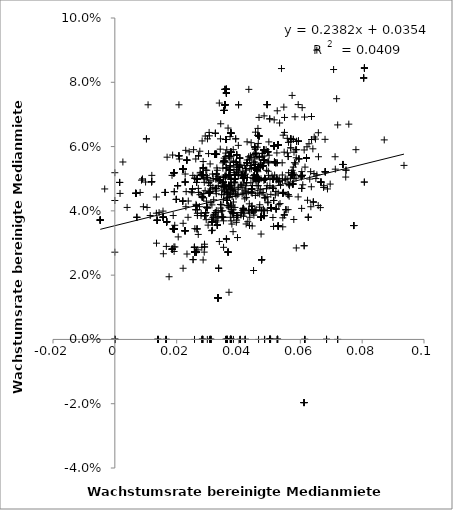
| Category | Series 0 |
|---|---|
| 0.0472984029364403 | 0.033 |
| 0.0584246690257582 | 0.055 |
| 0.0508449237536843 | 0.051 |
| 0.0308237016369515 | 0.055 |
| 0.0258220844768318 | 0.05 |
| 0.0292441796206047 | 0.063 |
| 0.0466201438738298 | 0.063 |
| 0.0594046757396542 | 0.062 |
| 0.0594046757396542 | 0.062 |
| 0.0569020540282394 | 0.062 |
| 0.0466201438738298 | 0.063 |
| 0.0594046757396542 | 0.062 |
| 0.0594046757396542 | 0.062 |
| 0.0594046757396542 | 0.062 |
| 0.0466201438738298 | 0.063 |
| 0.0466201438738298 | 0.063 |
| 0.0305810897801471 | 0.063 |
| 0.0594046757396542 | 0.062 |
| 0.0353198076879537 | 0.055 |
| 0.0594046757396542 | 0.062 |
| 0.0466201438738298 | 0.063 |
| 0.0594046757396542 | 0.062 |
| 0.0495657983080176 | 0.055 |
| 0.0594046757396542 | 0.062 |
| 0.0594046757396542 | 0.062 |
| 0.0594046757396542 | 0.062 |
| 0.0594046757396542 | 0.062 |
| 0.0134735724010606 | 0.03 |
| 0.0191117684152269 | 0.029 |
| 0.0344784002985594 | 0.04 |
| 0.0194391226497097 | 0.029 |
| 0.0418844034228878 | 0.054 |
| 0.0935285444669238 | 0.054 |
| 0.0315879306818856 | 0.034 |
| 0.00862437780222236 | 0.05 |
| 0.0440346832520202 | 0.054 |
| 0.0290255041303815 | 0.029 |
| 0.0440346832520202 | 0.054 |
| 0.0484396235996634 | 0 |
| 0.0290255041303815 | 0.029 |
| 0.0440346832520202 | 0.054 |
| 0.0310253637803168 | 0.047 |
| 0.0299662683665434 | 0.062 |
| 0.0310543992141599 | 0.043 |
| 0.0102231195014653 | 0.062 |
| 0.0102231195014653 | 0.062 |
| 0.0227519969532073 | 0.051 |
| 0.0399107931990526 | 0.051 |
| 0.0275936253738713 | 0.051 |
| 0.0569087104515864 | 0.062 |
| 0.0441367757546314 | 0.057 |
| 0.0569087104515864 | 0.062 |
| 0.032865944644789 | 0.051 |
| 0.0569087104515864 | 0.062 |
| 0.0390930776223894 | 0.062 |
| 0.032865944644789 | 0.051 |
| 0.0399235213975684 | 0.052 |
| 0.032865944644789 | 0.051 |
| 0.0569087104515864 | 0.062 |
| 0.0569087104515864 | 0.062 |
| 0.0390930776223894 | 0.062 |
| 0.0341685858548983 | 0.062 |
| 0.0361094656143461 | 0.047 |
| 0.0520766619585216 | 0.055 |
| 0.0497821215951242 | 0.055 |
| 0.0524157627884947 | 0.058 |
| 0.0525936049077533 | 0.055 |
| 0.0496972744387063 | 0.055 |
| 0.034962676833179 | 0.055 |
| 0.0548895925061723 | 0.069 |
| 0.0543291194043938 | 0.038 |
| 0.0679902764325737 | 0.062 |
| 0.037635381643605 | 0.04 |
| 0.0577273783818577 | 0.062 |
| 0.0448877797362366 | 0.055 |
| 0.0541233372221148 | 0.055 |
| 0.0577273783818577 | 0.062 |
| 0.0520766619585216 | 0.055 |
| 0.0520766619585216 | 0.055 |
| 0.0520766619585216 | 0.055 |
| 0.0374968240368005 | 0.05 |
| 0.0642163880928841 | 0.043 |
| 0.0314682634015913 | 0.037 |
| 0.0314682634015913 | 0.037 |
| 0.0398059265402597 | 0.053 |
| 0.0314682634015913 | 0.037 |
| 0.0416771044579314 | 0.05 |
| 0.0642163880928841 | 0.043 |
| 0.0314682634015913 | 0.037 |
| 0.0504632431386782 | 0.045 |
| 0.0416771044579314 | 0.05 |
| 0.0435568720964394 | 0.035 |
| 0.052220062089732 | 0.05 |
| 0.0314682634015913 | 0.037 |
| 0.0314682634015913 | 0.037 |
| 0.0460748780728162 | 0.06 |
| 0.0501514121459987 | 0.048 |
| 0.0550305197670198 | 0.05 |
| 0.0642163880928841 | 0.043 |
| 0.038374621956627 | 0.043 |
| 0.0295577260319317 | 0.05 |
| 0.0772422752195665 | 0.035 |
| 0.0443065939291676 | 0.04 |
| 0.0658260406202922 | 0.064 |
| 0.0443065939291676 | 0.04 |
| 0.0443065939291676 | 0.04 |
| 0.0443065939291676 | 0.04 |
| 0.0772422752195665 | 0.035 |
| 0.0772422752195665 | 0.035 |
| 0.0586927928464516 | 0.028 |
| 0.0443065939291676 | 0.04 |
| 0.0416142127505978 | 0.038 |
| 0.0443065939291676 | 0.04 |
| 0.0443065939291676 | 0.04 |
| 0.0443065939291676 | 0.04 |
| 0.0443065939291676 | 0.04 |
| 0.0443065939291676 | 0.04 |
| 0.0448694817805331 | 0.021 |
| 0.0443065939291676 | 0.04 |
| 0.0443065939291676 | 0.04 |
| 0.0772422752195665 | 0.035 |
| 0.0772422752195665 | 0.035 |
| 0.0443065939291676 | 0.04 |
| 0.0443065939291676 | 0.04 |
| 0.0772422752195665 | 0.035 |
| 0.0772422752195665 | 0.035 |
| 0.0443065939291676 | 0.04 |
| 0.0772422752195665 | 0.035 |
| 0.0772422752195665 | 0.035 |
| 0.0772422752195665 | 0.035 |
| 0.0443065939291676 | 0.04 |
| 0.0357997942870194 | 0.051 |
| 0.0416771044579314 | 0.05 |
| 0.0416771044579314 | 0.05 |
| 0.053440672431553 | 0.042 |
| 0.0426236892671901 | 0.049 |
| 0.0443801449852812 | 0.042 |
| 0.0464325820333029 | 0.05 |
| 0.0568404868356254 | 0.05 |
| 0.0416771044579314 | 0.05 |
| 0.0452958732018316 | 0.05 |
| 0.0452958732018316 | 0.05 |
| 0.0501905755623937 | 0.05 |
| 0.0452958732018316 | 0.05 |
| 0.0357997942870194 | 0.051 |
| 0.0416771044579314 | 0.05 |
| 0.0484054261651128 | 0.05 |
| 0.0416771044579314 | 0.05 |
| 0.0426236892671901 | 0.049 |
| 0.0416771044579314 | 0.05 |
| 0.0416771044579314 | 0.05 |
| 0.0416771044579314 | 0.05 |
| 0.0452958732018316 | 0.05 |
| 0.0586081034842945 | 0.05 |
| 0.0462905682979529 | 0.05 |
| 0.0603882025434617 | 0.051 |
| 0.0462905682979529 | 0.05 |
| 0.0553515901770947 | 0.04 |
| 0.0452513651188913 | 0.06 |
| 0.0571011818243403 | 0.052 |
| 0.038204094521072 | 0.046 |
| 0.0560424443959484 | 0.045 |
| 0.0397791106799745 | 0.045 |
| 0.0455061313315321 | 0.054 |
| 0.0543660638745334 | 0.045 |
| 0.0452513651188913 | 0.06 |
| 0.047285771294185 | 0.05 |
| 0.0543660638745334 | 0.045 |
| 0.0560424443959484 | 0.045 |
| 0.0560424443959484 | 0.045 |
| 0.0352791091034568 | 0.045 |
| 0.0344964205256921 | 0.045 |
| 0.0275326735456307 | 0.045 |
| 0.0543660638745334 | 0.045 |
| 0.0495354083647999 | 0.043 |
| 0.0444152817091636 | 0.045 |
| 0.0515465456609958 | 0.068 |
| 0.0560424443959484 | 0.04 |
| 0.0543660638745334 | 0.045 |
| 0.0452513651188913 | 0.06 |
| 0.0452513651188913 | 0.06 |
| 0.0528604707316445 | 0.035 |
| 0.0455819761775365 | 0.058 |
| 0.0528604707316445 | 0.035 |
| 0.0455819761775365 | 0.058 |
| 0.0356501917420706 | 0.048 |
| 0.0455819761775365 | 0.058 |
| 0.0496356947694476 | 0.052 |
| 0.0470819553055453 | 0.055 |
| 0.0476981025209366 | 0.058 |
| 0.0441476210562612 | 0.053 |
| 0.0528604707316445 | 0.035 |
| 0.0528604707316445 | 0.035 |
| 0.0476981025209366 | 0.058 |
| 0.0528604707316445 | 0.035 |
| 0.0375722511268068 | 0.057 |
| 0.0528604707316445 | 0.035 |
| 0.0528604707316445 | 0.035 |
| 0.0455819761775365 | 0.058 |
| 0.0528604707316445 | 0.035 |
| 0.0529587247476679 | 0.049 |
| 0.0427824340699137 | 0.061 |
| 0.0476981025209366 | 0.058 |
| 0.0455819761775365 | 0.058 |
| 0.043859609330408 | 0.057 |
| 0.0270578753804043 | 0.057 |
| 0.0207362119368186 | 0.057 |
| 0.0382688452844751 | 0.039 |
| 0.0473446300530473 | 0.04 |
| 0.0295547093287067 | 0.037 |
| 0.0382688452844751 | 0.039 |
| 0.0207362119368186 | 0.057 |
| 0.0420385538553767 | 0.039 |
| 0.0279453529676457 | 0.039 |
| 0.0484715453091311 | 0.05 |
| 0.0134318993965585 | 0.039 |
| 0.0382688452844751 | 0.039 |
| 0.0207362119368186 | 0.057 |
| 0.0369033526360674 | 0.057 |
| 0.0270578753804043 | 0.057 |
| 0.0207362119368186 | 0.057 |
| 0.0369033526360674 | 0.057 |
| 0.0369033526360674 | 0.057 |
| 0.0270578753804043 | 0.057 |
| 0.0382688452844751 | 0.039 |
| 0.0382688452844751 | 0.039 |
| 0.0369450793851307 | 0.051 |
| 0.0387430919919927 | 0.051 |
| 0.0425220778088224 | 0.053 |
| 0.0548300210240191 | 0.039 |
| 0.0387430919919927 | 0.051 |
| 0.0451819702953271 | 0.051 |
| 0.0451819702953271 | 0.051 |
| 0.0387430919919927 | 0.051 |
| 0.0357222627840865 | 0.051 |
| 0.0548300210240191 | 0.039 |
| 0.0409632528508914 | 0.051 |
| 0.0387430919919927 | 0.051 |
| 0.0387430919919927 | 0.051 |
| 0.0541835609492023 | 0.051 |
| 0.0369450793851307 | 0.051 |
| 0.0525707039774213 | 0.05 |
| 0.0387430919919927 | 0.051 |
| 0.0387430919919927 | 0.051 |
| 0.0369450793851307 | 0.051 |
| 0.0387430919919927 | 0.051 |
| 0.0369450793851307 | 0.051 |
| 0.0369450793851307 | 0.051 |
| 0.0387430919919927 | 0.051 |
| 0.0548300210240191 | 0.039 |
| 0.0409632528508914 | 0.051 |
| 0.0409632528508914 | 0.051 |
| 0.0369450793851307 | 0.051 |
| 0.0387430919919927 | 0.051 |
| 0.0516805870386594 | 0.051 |
| 0.0387430919919927 | 0.051 |
| 0.0451819702953271 | 0.051 |
| 0.0653394041351174 | 0.09 |
| 0.0304955450331452 | 0.046 |
| 0.0415252471299639 | 0.046 |
| 0.0288379282387845 | 0.05 |
| 0.0462512829561044 | 0.046 |
| 0.0399553794828043 | 0.051 |
| 0.0304955450331452 | 0.046 |
| 0.0460463643816129 | 0.05 |
| 0.0457102461191368 | 0.04 |
| 0.0528442291706077 | 0.046 |
| 0.0482870864414438 | 0.07 |
| 0.0424314108217294 | 0.046 |
| 0.0579262666283684 | 0.05 |
| 0.0304955450331452 | 0.046 |
| 0.0456737213785305 | 0.05 |
| 0.0304955450331452 | 0.046 |
| 0.0304955450331452 | 0.046 |
| 0.0490973479533403 | 0.053 |
| 0.0383492750697025 | 0 |
| 0.0353198076879537 | 0.055 |
| 0.0353198076879537 | 0.055 |
| 0.0353198076879537 | 0.055 |
| 0.0573003352313326 | 0.051 |
| 0.0573003352313326 | 0.051 |
| 0.0353198076879537 | 0.055 |
| 0.0307082576180826 | 0 |
| 0.0747734431845293 | 0.053 |
| 0.0307082576180826 | 0 |
| 0.0353198076879537 | 0.055 |
| 0.0573003352313326 | 0.051 |
| 0.0353198076879537 | 0.055 |
| 0.0498999003991762 | 0.057 |
| 0.0353198076879537 | 0.055 |
| 0.0353198076879537 | 0.055 |
| 0.0353198076879537 | 0.055 |
| 0.0353198076879537 | 0.055 |
| 0.0353198076879537 | 0.055 |
| 0.0353198076879537 | 0.055 |
| 0.0353198076879537 | 0.055 |
| 0.0353198076879537 | 0.055 |
| 0.0573003352313326 | 0.051 |
| 0.0747734431845293 | 0.053 |
| 0.0353198076879537 | 0.055 |
| 0.0353198076879537 | 0.055 |
| 0.0307082576180826 | 0 |
| 0.0573003352313326 | 0.051 |
| 0.0455066909183917 | 0.058 |
| 0.0353198076879537 | 0.055 |
| 0.0564592785420854 | 0.048 |
| 0.0202972748596211 | 0.048 |
| 0.0377354071730436 | 0.048 |
| 0.037417035385632 | 0.042 |
| 0.0573777183329627 | 0.053 |
| 0.0155837171684363 | 0.04 |
| 0.044542376353341503 | 0.048 |
| 0.0493183635168868 | 0.04 |
| 0.0592885117630979 | 0.044 |
| 0.0362012318330105 | 0.045 |
| 0.0202972748596211 | 0.048 |
| 0.0498159370916695 | 0.061 |
| 0.0525300743515269 | 0.071 |
| 0.0490600486085766 | 0.047 |
| 0.0436129926880189 | 0.039 |
| 0.056160020828097 | 0.061 |
| 0.0413800505373541 | 0.052 |
| 0.0423422971844358 | 0.048 |
| 0.0393006852970745 | 0.036 |
| 0.0314029209496547 | 0.042 |
| 0.0334560689335137 | 0.048 |
| 0.0392030665735692 | 0.045 |
| 0.0372202644659614 | 0.045 |
| 0.0202972748596211 | 0.048 |
| 0.0464507500169884 | 0.048 |
| 0.0459998736737812 | 0.048 |
| 0.0676134078580226 | 0.048 |
| 0.0482817091107526 | 0.057 |
| 0.0440893045428497 | 0.061 |
| 0.080702520468481 | 0.049 |
| 0.0666612613517283 | 0.049 |
| 0.0737381102675203 | 0.054 |
| 0.0666612613517283 | 0.049 |
| 0.0737381102675203 | 0.054 |
| 0.0737381102675203 | 0.054 |
| 0.0666612613517283 | 0.049 |
| 0.0737381102675203 | 0.054 |
| 0.0443065939291676 | 0.04 |
| 0.0666612613517283 | 0.049 |
| 0.0623321375022665 | 0.043 |
| 0.0737381102675203 | 0.054 |
| 0.0737381102675203 | 0.054 |
| 0.0737381102675203 | 0.054 |
| 0.0640520166158893 | 0.059 |
| 0.0737381102675203 | 0.054 |
| 0.0666612613517283 | 0.049 |
| 0.0737381102675203 | 0.054 |
| 0.0443065939291676 | 0.04 |
| 0.0443065939291676 | 0.04 |
| 0.0584707768649135 | 0.059 |
| 0.0575869908044555 | 0.048 |
| 0.0575869908044555 | 0.048 |
| 0.080702520468481 | 0.049 |
| 0.0575869908044555 | 0.048 |
| 0.0575869908044555 | 0.048 |
| 0.0520919358211276 | 0.046 |
| 0.0443065939291676 | 0.04 |
| 0.0607951337190284 | 0.048 |
| 0.0612369984701053 | 0.029 |
| 0.0575869908044555 | 0.048 |
| 0.0612369984701053 | 0.029 |
| 0.0562545404592139 | 0.048 |
| 0.0575869908044555 | 0.048 |
| 0.0696539827434155 | 0.048 |
| 0.0420646894564927 | 0.046 |
| 0.0456666701600073 | 0.049 |
| 0.0573003352313326 | 0.051 |
| 0.0480665104200839 | 0.041 |
| 0.0573003352313326 | 0.051 |
| 0.0579511497886538 | 0.058 |
| 0.0513064625401964 | 0.05 |
| 0.0531576924896258 | 0.05 |
| 0.0454287598336365 | 0.059 |
| 0.057801944742685 | 0.052 |
| 0.0340972681136567 | 0.059 |
| 0.0573003352313326 | 0.051 |
| 0.0454287598336365 | 0.05 |
| 0.0561921375354835 | 0.052 |
| 0.0333993027119903 | 0.04 |
| 0.0436405939084159 | 0.053 |
| 0.0505791370910895 | 0.041 |
| 0.0454287598336365 | 0.05 |
| 0.0454287598336365 | 0.05 |
| 0.0454287598336365 | 0.05 |
| 0.0387342173266769 | 0.05 |
| 0.0454287598336365 | 0.059 |
| 0.0454287598336365 | 0.05 |
| 0.0454287598336365 | 0.05 |
| 0.0454287598336365 | 0.05 |
| 0.031833657879903 | 0.05 |
| 0.0435643011968943 | 0.056 |
| 0.0454287598336365 | 0.05 |
| 0.0454287598336365 | 0.05 |
| 0.0530299029175476 | 0.042 |
| 0.0573003352313326 | 0.051 |
| 0.0375835638952138 | 0.037 |
| 0.0454287598336365 | 0.05 |
| 0.0448929203208228 | 0.05 |
| 0.0390297180227828 | 0.05 |
| 0.0650315600592728 | 0.05 |
| 0.0327328984404125 | 0.05 |
| 0.0258574501630766 | 0.05 |
| 0.0448929203208228 | 0.05 |
| 0.0332436054100091 | 0.05 |
| 0.0454287598336365 | 0.05 |
| 0.0454287598336365 | 0.05 |
| 0.0573003352313326 | 0.051 |
| 0.0386392371587356 | 0.049 |
| 0.0604209926113932 | 0.041 |
| 0.0454287598336365 | 0.05 |
| 0.0653459294060108 | 0.051 |
| 0.0573003352313326 | 0.051 |
| 0.0273840940065768 | 0.041 |
| 0.063408107969688 | 0.041 |
| 0.00923716981220779 | 0.041 |
| 0.0542197524269332 | 0.05 |
| 0.0431397189497869 | 0.046 |
| 0.0543171442004196 | 0.035 |
| 0.0377315301323664 | 0.041 |
| 0.0492714487924277 | 0.048 |
| 0.0342247414461392 | 0.041 |
| 0.0229867575478426 | 0.041 |
| 0.0519171445929087 | 0.045 |
| 0.0369211953342259 | 0.015 |
| 0.0202972748596211 | 0.048 |
| 0.0374598755301823 | 0.048 |
| 0.0403869043116603 | 0.056 |
| 0.0361992282423145 | 0.047 |
| -0.0032744868645358 | 0.047 |
| 0.0403869043116603 | 0.056 |
| 0.0484396235996634 | 0 |
| 0.0687806297301181 | 0.047 |
| 0.037983776117561 | 0.047 |
| 0.0423662073004567 | 0.047 |
| 0.0595390688335009 | 0.056 |
| 0.0484396235996634 | 0 |
| 0.0442661235245647 | 0.047 |
| 0.0442661235245647 | 0.047 |
| 0.0595390688335009 | 0.056 |
| 0.0403869043116603 | 0.056 |
| 0.0442661235245647 | 0.047 |
| 0.0595390688335009 | 0.056 |
| 0.0442661235245647 | 0.047 |
| 0.0324242879414642 | 0.047 |
| 0.0442661235245647 | 0.047 |
| 0.0403869043116603 | 0.056 |
| 0.0353769518680289 | 0.056 |
| 0.0399446551708096 | 0.06 |
| 0.0442661235245647 | 0.047 |
| 0.0442661235245647 | 0.047 |
| 0.0403869043116603 | 0.056 |
| 0.0251166730902559 | 0.047 |
| 0.0466201438738298 | 0.063 |
| 0.0544561943355606 | 0.064 |
| 0.0464963532244236 | 0.049 |
| 0.0327186093081506 | 0.037 |
| 0.0442661235245647 | 0.047 |
| 0.0470452222375763 | 0.047 |
| 0.0361992282423145 | 0.047 |
| 0.0251166730902559 | 0.047 |
| 0.0251166730902559 | 0.047 |
| 0.04714834857383 | 0.054 |
| 0.0371028203594996 | 0.057 |
| 0.04714834857383 | 0.054 |
| 0.0358626176106958 | 0.057 |
| 0.04714834857383 | 0.054 |
| 0.04714834857383 | 0.054 |
| 0.0392702480261697 | 0.055 |
| 0.0392702480261697 | 0.055 |
| 0.0371028203594996 | 0.057 |
| 0.04714834857383 | 0.054 |
| 0.0383917669002296 | 0.055 |
| 0.0392702480261697 | 0.055 |
| 0.0560666493982671 | 0.057 |
| 0.04714834857383 | 0.054 |
| 0.0392702480261697 | 0.055 |
| 0.0371028203594996 | 0.057 |
| 0.0383917669002296 | 0.055 |
| 0.0359276336798957 | 0.055 |
| 0.0407315220090843 | 0.054 |
| 0.0315786513380802 | 0.051 |
| 0.0383917669002296 | 0.055 |
| 0.04714834857383 | 0.054 |
| 0.0383917669002296 | 0.055 |
| 0.04714834857383 | 0.054 |
| 0.038868415865438 | 0.049 |
| 0.04714834857383 | 0.054 |
| 0.04714834857383 | 0.054 |
| 0.0560666493982671 | 0.057 |
| 0.0371028203594996 | 0.057 |
| 0.04714834857383 | 0.054 |
| 0.0434980385302159 | 0.042 |
| 0.0383917669002296 | 0.055 |
| 0.0383917669002296 | 0.055 |
| 0.04714834857383 | 0.054 |
| 0.0482094424528854 | 0.049 |
| 0.0492673607964367 | 0.044 |
| 0.0468493753295023 | 0.045 |
| 0.0459486665399436 | 0.053 |
| 0.0459486665399436 | 0.053 |
| 0.0459486665399436 | 0.053 |
| 0.0459486665399436 | 0.053 |
| 0.0459486665399436 | 0.053 |
| 0.031280470537121 | 0.034 |
| 0.0459486665399436 | 0.053 |
| 0.0459486665399436 | 0.053 |
| 0.0297437940407836 | 0.053 |
| 0.0459486665399436 | 0.053 |
| 0.0459486665399436 | 0.053 |
| 0.0459486665399436 | 0.053 |
| 0.0459486665399436 | 0.053 |
| 0.0331530225401599 | 0.053 |
| 0.0459486665399436 | 0.053 |
| 0.0459486665399436 | 0.053 |
| 0.0459486665399436 | 0.053 |
| 0.0459486665399436 | 0.053 |
| 0.0459486665399436 | 0.053 |
| 0.0459486665399436 | 0.053 |
| 0.0454647681330216 | 0.045 |
| 0.0459486665399436 | 0.053 |
| 0.0459486665399436 | 0.053 |
| 0.0459486665399436 | 0.053 |
| 0.0459486665399436 | 0.053 |
| 0.0459486665399436 | 0.053 |
| 0.034002110361077 | 0.05 |
| 0.0190941686628812 | 0.052 |
| 0.0 | 0.052 |
| 0.034002110361077 | 0.05 |
| 0.0190941686628812 | 0.052 |
| 0.0190941686628812 | 0.052 |
| 0.0190941686628812 | 0.052 |
| 0.0190941686628812 | 0.052 |
| 0.034002110361077 | 0.05 |
| 0.0190941686628812 | 0.052 |
| 0.0190941686628812 | 0.052 |
| 0.0190941686628812 | 0.052 |
| 0.0190941686628812 | 0.052 |
| 0.0190941686628812 | 0.052 |
| 0.0190941686628812 | 0.052 |
| 0.0190941686628812 | 0.052 |
| 0.034002110361077 | 0.05 |
| 0.034002110361077 | 0.05 |
| 0.034002110361077 | 0.05 |
| 0.034002110361077 | 0.05 |
| 0.034002110361077 | 0.05 |
| 0.034002110361077 | 0.05 |
| 0.034002110361077 | 0.05 |
| 0.0563518647260612 | 0.048 |
| 0.034002110361077 | 0.05 |
| 0.0485284336987426 | 0.044 |
| 0.0807393708570812 | 0.084 |
| 0.0807393708570812 | 0.084 |
| 0.0468756318206065 | 0.042 |
| 0.0684694710224032 | 0 |
| 0.0422799218333159 | 0.053 |
| 0.0473029427790062 | 0.038 |
| 0.0473029427790062 | 0.038 |
| 0.0422799218333159 | 0.053 |
| 0.0604646852805368 | 0.052 |
| 0.0684694710224032 | 0 |
| 0.0473029427790062 | 0.038 |
| 0.0613585742024887 | 0.069 |
| 0.0871391679211371 | 0.062 |
| 0.0422799218333159 | 0.053 |
| 0.0807393708570812 | 0.084 |
| 0.0422799218333159 | 0.053 |
| 0.0684694710224032 | 0 |
| 0.0422799218333159 | 0.053 |
| 0.0684694710224032 | 0 |
| 0.0422799218333159 | 0.053 |
| 0.0684694710224032 | 0 |
| 0.0807393708570812 | 0.084 |
| 0.0684694710224032 | 0 |
| 0.0587736260717879 | 0.059 |
| 0.0614265599663222 | 0 |
| 0.0648959489652792 | 0.062 |
| 0.0481240648168171 | 0.059 |
| 0.0481240648168171 | 0.059 |
| 0.0501003796388515 | 0.069 |
| 0.0614265599663222 | 0 |
| 0.0481240648168171 | 0.059 |
| 0.0481240648168171 | 0.059 |
| 0.0756779988902363 | 0.067 |
| 0.0501003796388515 | 0.069 |
| 0.0489430261531465 | 0.059 |
| 0.0481240648168171 | 0.059 |
| 0.0779850369702089 | 0.059 |
| 0.0614265599663222 | 0 |
| 0.0481240648168171 | 0.059 |
| 0.0614265599663222 | 0 |
| 0.0382976740098093 | 0.059 |
| 0.0481240648168171 | 0.059 |
| 0.0720867159661667 | 0 |
| 0.0481240648168171 | 0.059 |
| 0.0481240648168171 | 0.059 |
| 0.0807393708570812 | 0.084 |
| 0.0481240648168171 | 0.059 |
| 0.062164494041584 | 0.06 |
| 0.0614265599663222 | 0 |
| 0.0481240648168171 | 0.059 |
| 0.0720867159661667 | 0.067 |
| 0.0511375232612856 | 0.038 |
| 0.0481240648168171 | 0.059 |
| 0.0481240648168171 | 0.059 |
| 0.0481240648168171 | 0.059 |
| 0.0481240648168171 | 0.059 |
| 0.0720867159661667 | 0 |
| 0.0481240648168171 | 0.059 |
| 0.0397058847292195 | 0.054 |
| 0.0397058847292195 | 0.054 |
| 0.0397058847292195 | 0.054 |
| 0.0378607087616749 | 0.036 |
| 0.0397058847292195 | 0.054 |
| 0.03937679817604 | 0.057 |
| 0.03937679817604 | 0.057 |
| 0.0397058847292195 | 0.054 |
| 0.0397058847292195 | 0.054 |
| 0.03937679817604 | 0.057 |
| 0.0299644818216773 | 0.05 |
| 0.0186927173821407 | 0.057 |
| 0.03937679817604 | 0.057 |
| 0.0397058847292195 | 0.054 |
| 0.03937679817604 | 0.057 |
| 0.0459310553739898 | 0.05 |
| 0.0459310553739898 | 0.05 |
| 0.0459310553739898 | 0.05 |
| 0.03937679817604 | 0.057 |
| 0.03937679817604 | 0.057 |
| 0.03937679817604 | 0.057 |
| 0.03937679817604 | 0.057 |
| 0.0397058847292195 | 0.054 |
| 0.0327125357914222 | 0.046 |
| 0.0459310553739898 | 0.05 |
| 0.03937679817604 | 0.057 |
| 0.0428986596094694 | 0.05 |
| 0.0630379927520792 | 0.05 |
| 0.03937679817604 | 0.057 |
| 0.0459310553739898 | 0.05 |
| 0.03937679817604 | 0.057 |
| 0.03937679817604 | 0.057 |
| 0.03937679817604 | 0.057 |
| 0.03937679817604 | 0.057 |
| 0.0580852999342927 | 0.051 |
| 0.03937679817604 | 0.057 |
| 0.0397058847292195 | 0.054 |
| 0.03937679817604 | 0.057 |
| 0.037244769948374 | 0.053 |
| 0.0353661302898753 | 0.071 |
| 0.0353661302898753 | 0.071 |
| 0.0353661302898753 | 0.071 |
| 0.0353661302898753 | 0.071 |
| 0.037244769948374 | 0.053 |
| 0.0353661302898753 | 0.071 |
| 0.0353661302898753 | 0.071 |
| 0.037244769948374 | 0.053 |
| 0.037244769948374 | 0.053 |
| 0.0353661302898753 | 0.071 |
| 0.0353661302898753 | 0.071 |
| 0.037244769948374 | 0.053 |
| 0.0353661302898753 | 0.071 |
| 0.0353661302898753 | 0.071 |
| 0.037244769948374 | 0.053 |
| 0.037244769948374 | 0.053 |
| 0.0337913286458593 | 0.074 |
| 0.0353661302898753 | 0.071 |
| 0.037244769948374 | 0.053 |
| 0.037244769948374 | 0.053 |
| 0.0304996811132454 | 0.064 |
| 0.037244769948374 | 0.053 |
| 0.0362089545506648 | 0.059 |
| 0.0516392926688234 | 0.055 |
| 0.0192271966381887 | 0.046 |
| 0.0192271966381887 | 0.046 |
| 0.0308310182374945 | 0.046 |
| 0.0383604912639859 | 0.056 |
| 0.0308310182374945 | 0.046 |
| 0.0359462082734463 | 0 |
| 0.0516392926688234 | 0.055 |
| 0.0516392926688234 | 0.055 |
| 0.0516392926688234 | 0.055 |
| 0.0516392926688234 | 0.055 |
| 0.0308310182374945 | 0.046 |
| 0.0359462082734463 | 0 |
| 0.0359462082734463 | 0 |
| 0.0516392926688234 | 0.055 |
| 0.0516392926688234 | 0.055 |
| 0.0516392926688234 | 0.055 |
| 0.0335956325926388 | 0.05 |
| 0.0308310182374945 | 0.046 |
| 0.0308310182374945 | 0.046 |
| 0.0516392926688234 | 0.055 |
| 0.0516392926688234 | 0.055 |
| 0.0516392926688234 | 0.055 |
| 0.037933557384751 | 0.044 |
| 0.0359462082734463 | 0 |
| 0.0308310182374945 | 0.046 |
| 0.0383648733455848 | 0.046 |
| 0.0516392926688234 | 0.055 |
| 0.0359462082734463 | 0 |
| 0.0516392926688234 | 0.055 |
| 0.0308310182374945 | 0.046 |
| 0.0375328844429066 | 0.058 |
| 0.0375328844429066 | 0.058 |
| 0.0375328844429066 | 0.058 |
| 0.0375328844429066 | 0.058 |
| 0.036096478169356 | 0.077 |
| 0.0375328844429066 | 0.058 |
| 0.0375328844429066 | 0.058 |
| 0.0375328844429066 | 0.058 |
| 0.0375328844429066 | 0.058 |
| 0.0375328844429066 | 0.058 |
| 0.036096478169356 | 0.077 |
| 0.0375328844429066 | 0.058 |
| 0.0375328844429066 | 0.058 |
| 0.0375328844429066 | 0.058 |
| 0.0375328844429066 | 0.058 |
| 0.0375328844429066 | 0.058 |
| 0.0 | 0 |
| 0.0375328844429066 | 0.058 |
| 0.036096478169356 | 0.077 |
| 0.0375328844429066 | 0.058 |
| 0.036096478169356 | 0.077 |
| 0.036096478169356 | 0.077 |
| 0.0375328844429066 | 0.058 |
| 0.0375328844429066 | 0.058 |
| 0.036096478169356 | 0.077 |
| 0.0375328844429066 | 0.058 |
| 0.0375328844429066 | 0.058 |
| 0.0375328844429066 | 0.058 |
| 0.0375328844429066 | 0.058 |
| 0.0375328844429066 | 0.058 |
| 0.036096478169356 | 0.077 |
| 0.036096478169356 | 0.077 |
| 0.0375328844429066 | 0.058 |
| 0.0375328844429066 | 0.058 |
| 0.0375328844429066 | 0.058 |
| 0.0375328844429066 | 0.058 |
| 0.036096478169356 | 0.077 |
| 0.0657760275816002 | 0.042 |
| 0.080478184324642 | 0.081 |
| 0.0415757568477044 | 0.041 |
| 0.0415757568477044 | 0.041 |
| 0.0547659410388084 | 0.058 |
| 0.0415757568477044 | 0.041 |
| 0.0415757568477044 | 0.041 |
| 0.0415757568477044 | 0.041 |
| 0.0415757568477044 | 0.041 |
| 0.0415757568477044 | 0.041 |
| 0.0415757568477044 | 0.041 |
| 0.080478184324642 | 0.081 |
| 0.0415757568477044 | 0.041 |
| 0.080478184324642 | 0.081 |
| 0.080478184324642 | 0.081 |
| 0.0347121079334913 | 0.046 |
| 0.0346087158621209 | 0.042 |
| 0.0299335709016959 | 0.041 |
| 0.00676191218384359 | 0.045 |
| 0.0521678647761601 | 0.041 |
| 0.0139565429647734 | 0 |
| 0.00676191218384359 | 0.045 |
| 0.0139565429647734 | 0 |
| 0.00676191218384359 | 0.045 |
| 0.00676191218384359 | 0.045 |
| 0.00676191218384359 | 0.045 |
| 0.00676191218384359 | 0.045 |
| 0.00676191218384359 | 0.045 |
| 0.00168518958981911 | 0.045 |
| 0.0139565429647734 | 0 |
| 0.00676191218384359 | 0.045 |
| 0.0139565429647734 | 0 |
| 0.00676191218384359 | 0.045 |
| 0.0139565429647734 | 0 |
| 0.0287734147258654 | 0.045 |
| 0.0139565429647734 | 0 |
| 0.0139565429647734 | 0 |
| 0.00676191218384359 | 0.045 |
| 0.00676191218384359 | 0.045 |
| 0.00676191218384359 | 0.045 |
| 0.00676191218384359 | 0.045 |
| 0.0266978812976 | 0.039 |
| 0.00676191218384359 | 0.045 |
| 0.00676191218384359 | 0.045 |
| 0.0139565429647734 | 0 |
| 0.0422041087768772 | 0 |
| 0.0137395292338038 | 0.037 |
| 0.0137395292338038 | 0.037 |
| 0.0337996704267369 | 0.03 |
| 0.028165520873485 | 0.051 |
| 0.0422041087768772 | 0 |
| 0.028165520873485 | 0.051 |
| 0.0422041087768772 | 0 |
| 0.0422041087768772 | 0 |
| 0.0137395292338038 | 0.037 |
| 0.0137395292338038 | 0.037 |
| 0.0137395292338038 | 0.037 |
| 0.0137395292338038 | 0.037 |
| 0.028165520873485 | 0.051 |
| 0.0137395292338038 | 0.037 |
| 0.0422041087768772 | 0 |
| 0.028165520873485 | 0.051 |
| 0.028165520873485 | 0 |
| 0.028165520873485 | 0.051 |
| 0.028165520873485 | 0.051 |
| 0.0137395292338038 | 0.037 |
| 0.041736209817625 | 0.049 |
| 0.028165520873485 | 0.051 |
| 0.028165520873485 | 0.051 |
| 0.028165520873485 | 0.051 |
| 0.028165520873485 | 0.051 |
| 0.028165520873485 | 0.051 |
| 0.028165520873485 | 0.051 |
| 0.028165520873485 | 0.051 |
| 0.028165520873485 | 0.051 |
| 0.028165520873485 | 0.051 |
| 0.028165520873485 | 0.051 |
| 0.028165520873485 | 0.051 |
| 0.028165520873485 | 0.051 |
| 0.028165520873485 | 0.051 |
| 0.0422041087768772 | 0 |
| 0.028165520873485 | 0.051 |
| 0.0137395292338038 | 0.037 |
| 0.0137395292338038 | 0.037 |
| 0.042795014427609 | 0.055 |
| 0.042795014427609 | 0.055 |
| 0.042795014427609 | 0.055 |
| 0.0492689382578564 | 0.073 |
| 0.042795014427609 | 0.055 |
| 0.0492689382578564 | 0.073 |
| 0.042795014427609 | 0.055 |
| 0.0492689382578564 | 0.073 |
| 0.042795014427609 | 0.055 |
| 0.0492689382578564 | 0.073 |
| 0.042795014427609 | 0.055 |
| 0.044870672749459 | 0.04 |
| 0.0593142183447044 | 0.073 |
| 0.042795014427609 | 0.055 |
| 0.0580920689402302 | 0.055 |
| 0.042795014427609 | 0.055 |
| 0.042795014427609 | 0.055 |
| 0.0492689382578564 | 0.073 |
| 0.0492689382578564 | 0.073 |
| 0.019231333383761 | 0.034 |
| 0.019231333383761 | 0.034 |
| 0.019231333383761 | 0.034 |
| 0.026606906533813 | 0.034 |
| 0.019231333383761 | 0.034 |
| 0.019231333383761 | 0.034 |
| 0.019231333383761 | 0.034 |
| 0.019231333383761 | 0.034 |
| 0.019231333383761 | 0.034 |
| 0.019231333383761 | 0.034 |
| 0.019231333383761 | 0.034 |
| 0.026606906533813 | 0.034 |
| 0.019231333383761 | 0.034 |
| 0.019231333383761 | 0.034 |
| 0.019231333383761 | 0.034 |
| 0.019231333383761 | 0.034 |
| 0.019231333383761 | 0.034 |
| 0.019231333383761 | 0.034 |
| 0.019231333383761 | 0.034 |
| 0.019231333383761 | 0.034 |
| 0.019231333383761 | 0.034 |
| 0.019231333383761 | 0.034 |
| 0.019231333383761 | 0.034 |
| 0.019231333383761 | 0.034 |
| 0.019231333383761 | 0.034 |
| 0.019231333383761 | 0.034 |
| 0.019231333383761 | 0.034 |
| 0.019231333383761 | 0.034 |
| 0.019231333383761 | 0.034 |
| 0.019231333383761 | 0.034 |
| 0.019231333383761 | 0.034 |
| 0.0186447319381229 | 0.034 |
| 0.019231333383761 | 0.034 |
| 0.019231333383761 | 0.034 |
| 0.019231333383761 | 0.034 |
| 0.026606906533813 | 0.034 |
| 0.019231333383761 | 0.034 |
| 0.019231333383761 | 0.034 |
| 0.0473029427790062 | 0.038 |
| 0.06259009583922 | 0.038 |
| 0.0185586229297294 | 0.028 |
| 0.06259009583922 | 0.038 |
| 0.0185586229297294 | 0.028 |
| 0.0473029427790062 | 0.038 |
| 0.0473029427790062 | 0.038 |
| 0.0473029427790062 | 0.038 |
| 0.0473029427790062 | 0.038 |
| 0.0473029427790062 | 0.038 |
| 0.06259009583922 | 0.038 |
| 0.0473029427790062 | 0.038 |
| 0.0473029427790062 | 0.038 |
| 0.0473029427790062 | 0.038 |
| 0.0473029427790062 | 0.038 |
| 0.0473029427790062 | 0.038 |
| 0.0473029427790062 | 0.038 |
| 0.0473029427790062 | 0.038 |
| 0.0424693664966929 | 0.036 |
| 0.0185586229297294 | 0.028 |
| 0.0185586229297294 | 0.028 |
| 0.0361367131724135 | 0.031 |
| 0.0191771799526681 | 0.027 |
| 0.0635580231123405 | 0.047 |
| 0.0675219813791221 | 0.047 |
| 0.0473029427790062 | 0.038 |
| 0.0473029427790062 | 0.038 |
| 0.0473029427790062 | 0.038 |
| 0.0473029427790062 | 0.038 |
| 0.0444256543658648 | 0.035 |
| 0.0185586229297294 | 0.028 |
| 0.0644215315326591 | 0.052 |
| 0.0436464591342745 | 0.038 |
| 0.0185586229297294 | 0.028 |
| 0.0373573127051652 | 0.038 |
| 0.0473029427790062 | 0.038 |
| 0.0345711931408541 | 0.038 |
| 0.0473029427790062 | 0.038 |
| 0.0473029427790062 | 0.038 |
| 0.0473029427790062 | 0.038 |
| 0.0384881407289448 | 0.038 |
| 0.0227292140169599 | 0.034 |
| 0.0227292140169599 | 0.034 |
| 0.0227292140169599 | 0.034 |
| 0.0557856203372633 | 0.063 |
| 0.0227292140169599 | 0.034 |
| 0.0227292140169599 | 0.034 |
| 0.0227292140169599 | 0.034 |
| 0.0227292140169599 | 0.034 |
| 0.034887172734023 | 0.038 |
| 0.0227292140169599 | 0.034 |
| 0.0227292140169599 | 0.034 |
| 0.0227292140169599 | 0.034 |
| 0.0227292140169599 | 0.034 |
| 0.0227292140169599 | 0.034 |
| 0.019231333383761 | 0.034 |
| 0.0227292140169599 | 0.034 |
| 0.0227292140169599 | 0.034 |
| 0.0227292140169599 | 0.034 |
| 0.0227292140169599 | 0.034 |
| 0.0531608548004783 | 0.049 |
| 0.0227292140169599 | 0.034 |
| 0.0227292140169599 | 0.034 |
| 0.0227292140169599 | 0.034 |
| 0.0227292140169599 | 0.034 |
| 0.0227292140169599 | 0.034 |
| 0.0227292140169599 | 0.034 |
| 0.034887172734023 | 0.038 |
| 0.0227292140169599 | 0.034 |
| 0.0227292140169599 | 0.034 |
| 0.0227292140169599 | 0.034 |
| 0.0227292140169599 | 0.034 |
| 0.0 | 0 |
| 0.0227292140169599 | 0.034 |
| 0.0263208806605477 | 0.027 |
| 0.0402801772222552 | 0.054 |
| 0.0402801772222552 | 0.054 |
| 0.019231333383761 | 0.034 |
| 0.0263208806605477 | 0.027 |
| 0.0263208806605477 | 0.027 |
| 0.0263208806605477 | 0.027 |
| 0.019231333383761 | 0.034 |
| 0.019231333383761 | 0.034 |
| 0.019231333383761 | 0.034 |
| 0.0284507333033146 | 0 |
| 0.019231333383761 | 0.034 |
| 0.019231333383761 | 0.034 |
| 0.0 | 0.027 |
| 0.0263208806605477 | 0.027 |
| 0.0263208806605477 | 0.027 |
| 0.0284507333033146 | 0 |
| 0.0402801772222552 | 0.054 |
| 0.0263208806605477 | 0.027 |
| 0.0263208806605477 | 0.027 |
| 0.0402801772222552 | 0.054 |
| 0.019231333383761 | 0.034 |
| 0.0263208806605477 | 0.027 |
| 0.0402801772222552 | 0.054 |
| 0.0284507333033146 | 0 |
| 0.0263208806605477 | 0.027 |
| 0.0237585508070162 | 0.043 |
| 0.0375882167583117 | 0.04 |
| 0.0269822239632185 | 0.033 |
| 0.0262536489255225 | 0.042 |
| 0.0290327921550277 | 0.039 |
| 0.0290327921550277 | 0.039 |
| 0.0114448481225327 | 0.039 |
| 0.0290327921550277 | 0.039 |
| 0.0290327921550277 | 0.039 |
| 0.0290327921550277 | 0.039 |
| 0.0290327921550277 | 0.039 |
| 0.0290327921550277 | 0.039 |
| 0.0290327921550277 | 0.039 |
| 0.0290327921550277 | 0.039 |
| 0.0290327921550277 | 0.039 |
| 0.0327038435368847 | 0.05 |
| 0.0290327921550277 | 0.039 |
| 0.0333913734169862 | 0.051 |
| 0.0290327921550277 | 0.039 |
| 0.0290327921550277 | 0.039 |
| 0.0290327921550277 | 0.039 |
| 0.0290327921550277 | 0.039 |
| 0.0290327921550277 | 0.039 |
| 0.0267068399051826 | 0.039 |
| 0.0290327921550277 | 0.039 |
| 0.0290327921550277 | 0.039 |
| 0.0290327921550277 | 0.039 |
| 0.0290327921550277 | 0.039 |
| 0.0278730461053067 | 0.039 |
| 0.0290327921550277 | 0.039 |
| 0.0290327921550277 | 0.039 |
| 0.0290327921550277 | 0.039 |
| 0.0290327921550277 | 0.039 |
| 0.0389037695814412 | 0.05 |
| 0.0188808704789776 | 0.039 |
| 0.0290327921550277 | 0.039 |
| 0.0290327921550277 | 0.039 |
| 0.0290327921550277 | 0.039 |
| 0.0484053551320782 | 0.039 |
| 0.0290327921550277 | 0.039 |
| 0.0349554889589172 | 0.049 |
| 0.0349554889589172 | 0.049 |
| 0.0349554889589172 | 0.049 |
| 0.0521678647761601 | 0.041 |
| 0.0304491245573411 | 0.049 |
| 0.0349554889589172 | 0.049 |
| 0.0264403603912229 | 0.049 |
| 0.0349554889589172 | 0.049 |
| 0.00154870753711611 | 0.049 |
| 0.0349554889589172 | 0.049 |
| -0.00471215320339369 | 0.037 |
| 0.0205049137274089 | 0.032 |
| 0.0349554889589172 | 0.049 |
| 0.0349554889589172 | 0.049 |
| 0.0264403603912229 | 0.049 |
| 0.031974211877444 | 0.043 |
| 0.0349554889589172 | 0.049 |
| 0.0349554889589172 | 0.049 |
| 0.00154870753711611 | 0.049 |
| 0.0349554889589172 | 0.049 |
| 0.0349554889589172 | 0.049 |
| 0.0349554889589172 | 0.049 |
| 0.0390203686337263 | 0.045 |
| 0.0349554889589172 | 0.049 |
| 0.0521678647761601 | 0.041 |
| 0.0521678647761601 | 0.041 |
| 0.0264403603912229 | 0.049 |
| 0.0264403603912229 | 0.049 |
| 0.00154870753711611 | 0.049 |
| 0.0349554889589172 | 0.049 |
| 0.0349554889589172 | 0.049 |
| 0.0349554889589172 | 0.049 |
| 0.00154870753711611 | 0.049 |
| 0.0331923163567496 | 0.036 |
| 0.0331923163567496 | 0.036 |
| 0.0331923163567496 | 0.036 |
| 0.0331923163567496 | 0.036 |
| 0.0331923163567496 | 0.036 |
| 0.0331923163567496 | 0.036 |
| 0.0331923163567496 | 0.036 |
| 0.0331923163567496 | 0.036 |
| 0.0320714095437991 | 0.039 |
| 0.0331923163567496 | 0.036 |
| 0.0193712884379029 | 0.036 |
| 0.0268714881367866 | 0.028 |
| 0.0331923163567496 | 0.036 |
| 0.0331923163567496 | 0.036 |
| 0.0331923163567496 | 0.036 |
| 0.0331923163567496 | 0.036 |
| 0.0331923163567496 | 0.036 |
| 0.0408772075892272 | 0.039 |
| 0.0400175479344282 | 0.073 |
| 0.0293530248543579 | 0.039 |
| 0.0207327320421329 | 0.073 |
| 0.0606466199910898 | 0.051 |
| 0.0406043645340342 | 0.048 |
| 0.0606466199910898 | 0.051 |
| 0.0285826759603505 | 0.051 |
| 0.0356200685764121 | 0.073 |
| 0.0356200685764121 | 0.073 |
| 0.0107480138380207 | 0.073 |
| 0.0408772075892272 | 0.039 |
| 0.0285826759603505 | 0.051 |
| 0.0606466199910898 | 0.051 |
| 0.0356200685764121 | 0.073 |
| 0.0408772075892272 | 0.039 |
| 0.0356200685764121 | 0.073 |
| 0.0293530248543579 | 0.039 |
| 0.0356200685764121 | 0.073 |
| 0.0143092908595095 | 0.039 |
| 0.0606466199910898 | 0.051 |
| 0.0356200685764121 | 0.073 |
| 0.0293530248543579 | 0.039 |
| 0.0356200685764121 | 0.073 |
| 0.0400175479344282 | 0.073 |
| 0.0356200685764121 | 0.073 |
| 0.0285826759603505 | 0.051 |
| 0.0356200685764121 | 0.073 |
| 0.0356200685764121 | 0.073 |
| 0.0395177008248273 | 0.039 |
| 0.0297082316020467 | 0.041 |
| 0.0297082316020467 | 0.041 |
| 0.0297082316020467 | 0.041 |
| 0.0297082316020467 | 0.041 |
| 0.0395177008248273 | 0.039 |
| 0.0394007461301535 | 0.037 |
| 0.0297082316020467 | 0.041 |
| 0.0297082316020467 | 0.041 |
| 0.0104259633014376 | 0.041 |
| -0.00471215320339369 | 0.037 |
| 0.0297082316020467 | 0.041 |
| 0.00260225047959151 | 0.055 |
| 0.0290141695948987 | 0.03 |
| 0.0297082316020467 | 0.041 |
| 0.0297082316020467 | 0.041 |
| 0.0388533869318826 | 0.041 |
| -0.00471215320339369 | 0.037 |
| 0.00398023013067483 | 0.041 |
| 0.0395177008248273 | 0.039 |
| 0.0395177008248273 | 0.039 |
| -0.00471215320339369 | 0.037 |
| -0.00471215320339369 | 0.037 |
| 0.0297082316020467 | 0.041 |
| 0.0297082316020467 | 0.041 |
| -0.00471215320339369 | 0.037 |
| -0.00471215320339369 | 0.037 |
| 0.0175474287715991 | 0.02 |
| 0.0333676030779309 | 0.013 |
| 0.0333676030779309 | 0.013 |
| 0.0333676030779309 | 0.013 |
| 0.0333676030779309 | 0.013 |
| 0.0333676030779309 | 0.013 |
| 0.0333676030779309 | 0.013 |
| 0.0333676030779309 | 0.013 |
| 0.0333676030779309 | 0.013 |
| 0.0333676030779309 | 0.013 |
| 0.0333676030779309 | 0.013 |
| 0.0333676030779309 | 0.013 |
| 0.0333676030779309 | 0.013 |
| 0.0 | 0 |
| 0.0333676030779309 | 0.013 |
| 0.0333676030779309 | 0.013 |
| 0.0333676030779309 | 0.013 |
| 0.0333676030779309 | 0.013 |
| 0.022071045541783 | 0.053 |
| 0.022071045541783 | 0.053 |
| 0.022071045541783 | 0.053 |
| 0.022071045541783 | 0.053 |
| 0.022071045541783 | 0.053 |
| 0.022071045541783 | 0.053 |
| 0.0327265186425745 | 0.037 |
| 0.022071045541783 | 0.053 |
| 0.022071045541783 | 0.053 |
| 0.022071045541783 | 0.053 |
| 0.022071045541783 | 0.053 |
| 0.022071045541783 | 0.053 |
| 0.022071045541783 | 0.053 |
| 0.0713089567075167 | 0.053 |
| 0.022071045541783 | 0.053 |
| 0.022071045541783 | 0.053 |
| 0.022071045541783 | 0.053 |
| 0.022071045541783 | 0.053 |
| 0.022071045541783 | 0.053 |
| 0.022071045541783 | 0.053 |
| 0.022071045541783 | 0.053 |
| 0.022071045541783 | 0.053 |
| 0.0199174943550671 | 0.044 |
| 0.0199174943550671 | 0.044 |
| 0.0199174943550671 | 0.044 |
| 0.0199174943550671 | 0.044 |
| 0.0342496945279092 | 0.067 |
| 0.0199174943550671 | 0.044 |
| 0.0199174943550671 | 0.044 |
| 0.0199174943550671 | 0.044 |
| 0.0199174943550671 | 0.044 |
| 0.0289293564705404 | 0.049 |
| 0.0199174943550671 | 0.044 |
| 0.0402801772222552 | 0.054 |
| 0.0402801772222552 | 0.054 |
| 0.0165828516718596 | 0 |
| 0.0402801772222552 | 0.054 |
| 0.0402801772222552 | 0.054 |
| 0.0165828516718596 | 0 |
| 0.0344049986950588 | 0.048 |
| 0.0402801772222552 | 0.054 |
| 0.0402801772222552 | 0.054 |
| 0.0402801772222552 | 0.054 |
| 0.0165828516718596 | 0 |
| 0.0156956718498167 | 0.027 |
| 0.0165828516718596 | 0 |
| 0.0165828516718596 | 0 |
| 0.0402801772222552 | 0.054 |
| 0.0402801772222552 | 0.054 |
| 0.023065841596537 | 0.046 |
| 0.0341731705675907 | 0.042 |
| 0.0301672509971744 | 0.036 |
| 0.0411734888969673 | 0.045 |
| 0.0425573035465743 | 0.044 |
| 0.0313411276238154 | 0.037 |
| 0.0363027894750492 | 0 |
| 0.0267027751293041 | 0.05 |
| 0.050587004071222 | 0.041 |
| 0.0267027751293041 | 0.05 |
| 0.0267027751293041 | 0.05 |
| 0.0363027894750492 | 0 |
| 0.0267027751293041 | 0.05 |
| 0.050587004071222 | 0.041 |
| 0.0267027751293041 | 0.05 |
| 0.050587004071222 | 0.041 |
| 0.0363027894750492 | 0 |
| 0.0267027751293041 | 0.05 |
| 0.0317079137922756 | 0.047 |
| 0.0363027894750492 | 0 |
| 0.050587004071222 | 0.041 |
| 0.050587004071222 | 0.041 |
| 0.0360706654689562 | 0.031 |
| 0.0267027751293041 | 0.05 |
| 0.0363027894750492 | 0 |
| 0.050587004071222 | 0.041 |
| 0.0363027894750492 | 0 |
| 0.0374775790655306 | 0.047 |
| 0.0552618354817467 | 0.05 |
| 0.0 | 0 |
| 0.050587004071222 | 0.041 |
| 0.0267027751293041 | 0.05 |
| 0.0267027751293041 | 0.05 |
| 0.0267027751293041 | 0.05 |
| 0.0360872881069307 | 0.078 |
| 0.0360872881069307 | 0.078 |
| 0.050587004071222 | 0.041 |
| 0.0351360100015583 | 0.037 |
| 0.0363027894750492 | 0 |
| 0.0267027751293041 | 0.05 |
| 0.0363027894750492 | 0 |
| 0.0267027751293041 | 0.05 |
| 0.00894316481325075 | 0.05 |
| 0.050587004071222 | 0.041 |
| 0.0557416740993846 | 0.05 |
| 0.0267027751293041 | 0.05 |
| 0.0267027751293041 | 0.05 |
| 0.0363027894750492 | 0 |
| 0.0664801229914267 | 0.041 |
| 0.050587004071222 | 0.041 |
| 0.0363027894750492 | 0 |
| 0.050587004071222 | 0.041 |
| 0.0433406041488205 | 0.078 |
| 0.0267027751293041 | 0.05 |
| 0.0267027751293041 | 0.05 |
| 0.050587004071222 | 0.041 |
| 0.0 | 0 |
| 0.050587004071222 | 0.041 |
| 0.050587004071222 | 0.041 |
| 0.0363027894750492 | 0 |
| 0.0267027751293041 | 0.05 |
| 0.050587004071222 | 0.041 |
| 0.0363027894750492 | 0 |
| 0.0360872881069307 | 0.078 |
| 0.0287373782174287 | 0.044 |
| 0.0604598189422885 | 0.047 |
| 0.038246329921783 | 0.034 |
| 0.0220881712202619 | 0.036 |
| 0.0325137230974133 | 0.039 |
| 0.039808605512597 | 0.047 |
| 0.0293530248543579 | 0.039 |
| 0.0366618079424572 | 0.042 |
| 0.0250237010196868 | 0.046 |
| 0.0394057274512918 | 0.053 |
| 0.0389223122336881 | 0.046 |
| 0.0366618079424572 | 0.042 |
| 0.0355805332783126 | 0.051 |
| 0.056377130197234 | 0.045 |
| 0.0293530248543579 | 0.039 |
| 0.0325137230974133 | 0.039 |
| 0.0292089162038425 | 0.046 |
| 0.0293530248543579 | 0.039 |
| 0.0604598189422885 | 0.047 |
| 0.0379308440486565 | 0.039 |
| 0.0325137230974133 | 0.039 |
| 0.0233350322441317 | 0.027 |
| 0.0293530248543579 | 0.039 |
| 0.0293530248543579 | 0.039 |
| 0.0270063798212141 | 0.047 |
| 0.0261775087924736 | 0.04 |
| 0.0448148891720666 | 0.051 |
| 0.0266992466074814 | 0.04 |
| 0.0310713982088573 | 0.049 |
| 0.0349558789537794 | 0.053 |
| 0.0553236888426181 | 0.04 |
| 0.0261775087924736 | 0.04 |
| 0.0185056164434814 | 0.051 |
| 0.0261775087924736 | 0.056 |
| 0.0440089024275372 | 0.049 |
| 0.0553236888426181 | 0.04 |
| 0.0208681049798904 | 0.056 |
| 0.0382726931556796 | 0.04 |
| 0.0387405666439551 | 0.049 |
| 0.011884776785519 | 0.049 |
| 0.0351357854391363 | 0.043 |
| 0.0373914918649865 | 0.045 |
| 0.011884776785519 | 0.049 |
| 0.0417728855190249 | 0.04 |
| 0.011884776785519 | 0.049 |
| 0.011884776785519 | 0.049 |
| 0.011884776785519 | 0.049 |
| 0.0328270100303036 | 0.04 |
| 0.011884776785519 | 0.049 |
| 0.0328183281912677 | 0.045 |
| 0.0252385898569765 | 0.051 |
| 0.011884776785519 | 0.049 |
| 0.0219625371506122 | 0.043 |
| 0.011884776785519 | 0.049 |
| 0.0219625371506122 | 0.043 |
| 0.0351700216593009 | 0.049 |
| 0.0219625371506122 | 0.043 |
| 0.0357326501063535 | 0.048 |
| 0.0419479306239683 | 0.051 |
| 0.0296431216068376 | 0.043 |
| 0.0330027199837772 | 0.053 |
| 0.0496982045103935 | 0.051 |
| 0.0219625371506122 | 0.043 |
| 0.011884776785519 | 0.049 |
| 0.011884776785519 | 0.049 |
| 0.0119615125132859 | 0.051 |
| 0.0285697782779493 | 0.055 |
| 0.0324563048191371 | 0.058 |
| 0.0232752539298127 | 0.056 |
| 0.0324563048191371 | 0.058 |
| 0.0324563048191371 | 0.058 |
| 0.0324563048191371 | 0.058 |
| 0.0324563048191371 | 0.058 |
| 0.0324563048191371 | 0.058 |
| 0.048216879670598 | 0.056 |
| 0.0232752539298127 | 0.056 |
| 0.0324563048191371 | 0.058 |
| 0.048216879670598 | 0.056 |
| 0.0324563048191371 | 0.058 |
| 0.0324563048191371 | 0.058 |
| 0.048216879670598 | 0.056 |
| 0.0232752539298127 | 0.056 |
| 0.048216879670598 | 0.056 |
| 0.0232752539298127 | 0.056 |
| 0.0328949159729799 | 0.058 |
| 0.0232752539298127 | 0.056 |
| 0.0328949159729799 | 0.058 |
| 0.0324563048191371 | 0.058 |
| 0.048216879670598 | 0.056 |
| 0.0328949159729799 | 0.058 |
| 0.0324563048191371 | 0.058 |
| 0.0324563048191371 | 0.058 |
| 0.0306842568484431 | 0.046 |
| 0.048216879670598 | 0.056 |
| 0.0232752539298127 | 0.056 |
| 0.0328949159729799 | 0.058 |
| 0.0328949159729799 | 0.058 |
| 0.048216879670598 | 0.056 |
| 0.0328949159729799 | 0.058 |
| 0.0324563048191371 | 0.058 |
| 0.0324563048191371 | 0.058 |
| 0.048216879670598 | 0.056 |
| 0.048216879670598 | 0.056 |
| 0.0324563048191371 | 0.058 |
| 0.0485521529032888 | 0.044 |
| 0.038515875814146 | 0.052 |
| 0.0353313959914254 | 0.048 |
| 0.0353313959914254 | 0.048 |
| 0.0353313959914254 | 0.048 |
| 0.0353313959914254 | 0.048 |
| 0.0420280295428677 | 0.044 |
| 0.035178537130671 | 0.05 |
| 0.049490001424773 | 0.043 |
| 0.0364165735555795 | 0.044 |
| 0.0353313959914254 | 0.048 |
| 0.0485521529032888 | 0.044 |
| 0.0294200035648966 | 0.053 |
| 0.0353313959914254 | 0.048 |
| 0.0353313959914254 | 0.048 |
| 0.0407928793411745 | 0.039 |
| 0.0356423183310162 | 0.078 |
| 0.0360872881069307 | 0.078 |
| 0.0360872881069307 | 0.078 |
| 0.0680914819416409 | 0.052 |
| 0.0680914819416409 | 0.052 |
| 0.0360872881069307 | 0.078 |
| 0.0746863015227368 | 0.051 |
| 0.0680914819416409 | 0.052 |
| 0.0360872881069307 | 0.078 |
| 0.0573449129200165 | 0.076 |
| 0.0356423183310162 | 0.078 |
| 0.0360872881069307 | 0.078 |
| 0.0680914819416409 | 0.052 |
| 0.0680914819416409 | 0.052 |
| 0.0360872881069307 | 0.078 |
| 0.0360872881069307 | 0.078 |
| 0.0680914819416409 | 0.052 |
| 0.0680914819416409 | 0.052 |
| 0.0356423183310162 | 0.078 |
| 0.0462281871278476 | 0.052 |
| 0.0360872881069307 | 0.078 |
| 0.0680914819416409 | 0.052 |
| 0.0680914819416409 | 0.052 |
| 0.0356423183310162 | 0.078 |
| 0.0466407741705523 | 0.069 |
| 0.0633308124770309 | 0.052 |
| 0.0360872881069307 | 0.078 |
| 0.0355583068367029 | 0.046 |
| 0.0276208573134864 | 0.052 |
| 0.0467882135091884 | 0.041 |
| 0.0354881931334163 | 0.046 |
| 0.0156694052668136 | 0.038 |
| 0.0264086418635601 | 0.042 |
| 0.0299708311058215 | 0.041 |
| 0.0156694052668136 | 0.038 |
| 0.0398325336821721 | 0.038 |
| 0.0236764078577296 | 0.038 |
| 0.0247458659036623 | 0.046 |
| 0.0303159469266898 | 0.058 |
| 0.0156694052668136 | 0.038 |
| 0.00712005585042319 | 0.038 |
| 0.0156694052668136 | 0.038 |
| 0.0285604482258028 | 0.025 |
| 0.0156694052668136 | 0.038 |
| 0.03087945694521 | 0.048 |
| 0.0264086418635601 | 0.042 |
| 0.042271020535305 | 0.051 |
| 0.0264086418635601 | 0.042 |
| 0.0156694052668136 | 0.038 |
| 0.0326042804990814 | 0.047 |
| 0.00712005585042319 | 0.038 |
| 0.0299207996870134 | 0 |
| 0.0156694052668136 | 0.038 |
| 0.0156694052668136 | 0.038 |
| 0.0264086418635601 | 0.042 |
| 0.0264086418635601 | 0.042 |
| 0.0351894250682054 | 0.038 |
| 0.0156694052668136 | 0.038 |
| 0.0156694052668136 | 0.038 |
| 0.0264086418635601 | 0.042 |
| 0.00712005585042319 | 0.038 |
| 0.0264086418635601 | 0.042 |
| 0.0376268883439876 | 0 |
| 0.0281419018859286 | 0.029 |
| 0.0229343085314462 | 0.059 |
| 0.0258801077718054 | 0.034 |
| 0.0282986283124811 | 0 |
| 0.0376268883439876 | 0 |
| 0.0376268883439876 | 0 |
| 0.0376268883439876 | 0 |
| 0.0282986283124811 | 0 |
| 0.0707591433775714 | 0.084 |
| 0.0257529239415402 | 0.029 |
| 0.0282986283124811 | 0 |
| 0.035167246804064 | 0.029 |
| 0.0257529239415402 | 0.029 |
| 0.0282986283124811 | 0 |
| 0.0376268883439876 | 0 |
| 0.0257529239415402 | 0.029 |
| 0.0376268883439876 | 0 |
| 0.0257529239415402 | 0.029 |
| 0.0282986283124811 | 0 |
| 0.0282986283124811 | 0 |
| 0.0376268883439876 | 0 |
| 0.0257529239415402 | 0.029 |
| 0.0376268883439876 | 0 |
| 0.0282986283124811 | 0 |
| 0.0282986283124811 | 0 |
| 0.0257733142511336 | 0.027 |
| 0.0400615787046805 | 0.047 |
| 0.0257733142511336 | 0.027 |
| 0.0257733142511336 | 0.027 |
| 0.0257733142511336 | 0.027 |
| 0.0257733142511336 | 0.027 |
| 0.0257733142511336 | 0.027 |
| 0.0257733142511336 | 0.027 |
| 0.0 | 0 |
| 0.0257733142511336 | 0.027 |
| 0.0257733142511336 | 0.027 |
| 0.0257733142511336 | 0 |
| 0.0366270764258889 | 0.027 |
| 0.0257733142511336 | 0.027 |
| 0.028908974868985 | 0.027 |
| 0.0257733142511336 | 0.027 |
| 0.0366270764258889 | 0.027 |
| 0.0257733142511336 | 0.027 |
| 0.0257733142511336 | 0.027 |
| 0.0257733142511336 | 0.027 |
| 0.0257733142511336 | 0.027 |
| 0.0366270764258889 | 0.027 |
| 0.0257733142511336 | 0.027 |
| 0.0366270764258889 | 0.066 |
| 0.0257733142511336 | 0.027 |
| 0.0366270764258889 | 0.027 |
| 0.0257733142511336 | 0.027 |
| 0.0257733142511336 | 0.027 |
| 0.0366270764258889 | 0.027 |
| 0.0257733142511336 | 0.027 |
| 0.0257733142511336 | 0.027 |
| 0.0257733142511336 | 0.027 |
| 0.0257733142511336 | 0.027 |
| 0.0257733142511336 | 0.027 |
| 0.0257733142511336 | 0.027 |
| 0.0 | 0 |
| 0.0366270764258889 | 0.027 |
| 0.0167336789618642 | 0.037 |
| 0.0167336789618642 | 0.037 |
| 0.0 | 0 |
| 0.0167336789618642 | 0.037 |
| 0.0167336789618642 | 0.037 |
| 0.0167336789618642 | 0.037 |
| 0.0167336789618642 | 0.037 |
| 0.0167336789618642 | 0.037 |
| 0.0282356581083527 | 0.062 |
| 0.0167336789618642 | 0.037 |
| 0.0167336789618642 | 0.037 |
| 0.0167336789618642 | 0.037 |
| 0.0 | 0 |
| 0.0167336789618642 | 0.037 |
| 0.0167336789618642 | 0.037 |
| 0.0167336789618642 | 0.037 |
| 0.0167336789618642 | 0.037 |
| 0.0167336789618642 | 0.037 |
| 0.0167336789618642 | 0.037 |
| 0.0167336789618642 | 0.037 |
| 0.0167336789618642 | 0.037 |
| 0.0167336789618642 | 0.037 |
| 0.0167336789618642 | 0.037 |
| 0.0167336789618642 | 0.037 |
| 0.0167336789618642 | 0.037 |
| 0.0167336789618642 | 0.037 |
| 0.0374963347692556 | 0.064 |
| 0.0374963347692556 | 0.064 |
| 0.0374963347692556 | 0.064 |
| 0.0374963347692556 | 0.064 |
| 0.0374963347692556 | 0.064 |
| 0.0374963347692556 | 0.064 |
| 0.0374963347692556 | 0.064 |
| 0.0374963347692556 | 0.064 |
| 0.0374963347692556 | 0.064 |
| 0.0463939478466711 | 0.061 |
| 0.0374963347692556 | 0.064 |
| 0.0374963347692556 | 0.064 |
| 0.0374963347692556 | 0.064 |
| 0.0374963347692556 | 0.064 |
| 0.0374963347692556 | 0.064 |
| 0.0374963347692556 | 0.064 |
| 0.0374963347692556 | 0.064 |
| 0.0325276273025237 | 0.064 |
| 0.0374963347692556 | 0.064 |
| 0.0374963347692556 | 0.064 |
| 0.0374963347692556 | 0.064 |
| 0.0374963347692556 | 0.064 |
| 0.0374963347692556 | 0.064 |
| 0.0374963347692556 | 0.064 |
| 0.0374963347692556 | 0 |
| 0.0325276273025237 | 0.064 |
| 0.0374963347692556 | 0.064 |
| 0.0325276273025237 | 0.064 |
| 0.0374963347692556 | 0.064 |
| 0.0374963347692556 | 0.064 |
| 0.0374963347692556 | 0.064 |
| 0.0474553902704891 | 0.025 |
| 0.0474553902704891 | 0.025 |
| 0.0253114749463157 | 0.025 |
| 0.0474553902704891 | 0.025 |
| 0.0474553902704891 | 0.025 |
| 0.0474553902704891 | 0.025 |
| 0.0449738381740097 | 0.039 |
| 0.0430149189436875 | 0.037 |
| 0.0282999024881287 | 0.044 |
| 0.0474553902704891 | 0.025 |
| 0.0474553902704891 | 0.025 |
| 0.0282999024881287 | 0.044 |
| 0.0369736039577022 | 0.044 |
| 0.0474553902704891 | 0.025 |
| 0.0474553902704891 | 0.025 |
| 0.0369736039577022 | 0.044 |
| 0.013439726902617 | 0.044 |
| 0.0474553902704891 | 0.025 |
| 0.0282999024881287 | 0.044 |
| 0.0333950670464165 | 0.038 |
| 0.0282999024881287 | 0.044 |
| 0.0282999024881287 | 0.044 |
| 0.0253114749463157 | 0.025 |
| 0.0317501276602645 | 0.038 |
| 0.0413228606470979 | 0.04 |
| 0.0282999024881287 | 0.044 |
| 0.0474553902704891 | 0.025 |
| 0.0474553902704891 | 0.025 |
| 0.0474553902704891 | 0.025 |
| 0.0318931417793289 | 0.038 |
| 0.0474553902704891 | 0.025 |
| 0.0282999024881287 | 0.044 |
| 0.049476539204983 | 0.058 |
| 0.0368799505256687 | 0.048 |
| 0.0373985267470651 | 0 |
| 0.0373985267470651 | 0 |
| 0.0368799505256687 | 0.048 |
| 0.0373985267470651 | 0 |
| 0.0373985267470651 | 0 |
| 0.049476539204983 | 0.058 |
| 0.0368799505256687 | 0.048 |
| 0.0368799505256687 | 0.048 |
| 0.0166574240924628 | 0.029 |
| 0.0368799505256687 | 0.048 |
| 0.0368799505256687 | 0.048 |
| 0.0373985267470651 | 0 |
| 0.0373985267470651 | 0 |
| 0.049476539204983 | 0.058 |
| 0.0373985267470651 | 0 |
| 0.0240595997573487 | 0.058 |
| 0.0368799505256687 | 0.048 |
| 0.0373985267470651 | 0 |
| 0.0373985267470651 | 0 |
| 0.0411693000640769 | 0.047 |
| 0.0303535287472358 | 0.049 |
| 0.0 | 0 |
| 0.0368799505256687 | 0.048 |
| 0.0368799505256687 | 0.048 |
| 0.0368799505256687 | 0.048 |
| 0.0368799505256687 | 0.048 |
| 0.0368799505256687 | 0.048 |
| 0.0368799505256687 | 0.048 |
| 0.049476539204983 | 0.058 |
| 0.0368799505256687 | 0.048 |
| 0.0373985267470651 | 0 |
| 0.0373985267470651 | 0 |
| 0.0373985267470651 | 0 |
| 0.0368799505256687 | 0.048 |
| 0.049476539204983 | 0.058 |
| 0.0373985267470651 | 0 |
| 0.0368799505256687 | 0.048 |
| 0.049476539204983 | 0.058 |
| 0.0364807735356798 | 0.046 |
| 0.0310264396643156 | 0 |
| 0.0169058947337168 | 0.057 |
| 0.0310264396643156 | 0 |
| 0.0364807735356798 | 0.046 |
| 0.0310264396643156 | 0 |
| 0.0364807735356798 | 0.046 |
| 0.0310264396643156 | 0 |
| 0.0364807735356798 | 0.046 |
| 0.0364807735356798 | 0.046 |
| 0.0364807735356798 | 0.046 |
| 0.0364807735356798 | 0.046 |
| 0.0310264396643156 | 0 |
| 0.0310264396643156 | 0 |
| 0.00818646292529723 | 0.046 |
| 0.0310264396643156 | 0 |
| 0.0441185340322969 | 0.046 |
| 0.0364807735356798 | 0.046 |
| 0.0270947669753454 | 0.046 |
| 0.0364807735356798 | 0.046 |
| 0.0364807735356798 | 0.046 |
| 0.0274876556866164 | 0.059 |
| 0.0364807735356798 | 0.046 |
| 0.0310264396643156 | 0 |
| 0.0364807735356798 | 0.046 |
| 0.0364807735356798 | 0.046 |
| 0.0364807735356798 | 0.046 |
| 0.0364807735356798 | 0.046 |
| 0.0364807735356798 | 0.046 |
| 0.0503586714959736 | 0 |
| 0.0603613899044559 | 0.051 |
| 0.0503586714959736 | 0 |
| 0.050343394317113 | 0 |
| 0.0482356166269358 | 0.038 |
| 0.0603613899044559 | 0.051 |
| 0.0603613899044559 | 0.051 |
| 0.041260834650791 | 0.051 |
| 0.0482356166269358 | 0.038 |
| 0.0503586714959736 | 0 |
| 0.0503586714959736 | 0 |
| 0.0442502097583384 | 0.041 |
| 0.0603613899044559 | 0.051 |
| 0.050343394317113 | 0 |
| 0.0603613899044559 | 0.051 |
| 0.0603613899044559 | 0.051 |
| 0.0603613899044559 | 0.051 |
| 0.0603613899044559 | 0.051 |
| 0.0603613899044559 | 0.051 |
| 0.0396747326020481 | 0.032 |
| 0.0603613899044559 | 0.051 |
| 0.0603613899044559 | 0.051 |
| 0.0603613899044559 | 0.051 |
| 0.0603613899044559 | 0.051 |
| 0.0603613899044559 | 0.051 |
| 0.0603613899044559 | 0.051 |
| 0.0603613899044559 | 0.051 |
| 0.0603613899044559 | 0.051 |
| 0.041260834650791 | 0.051 |
| 0.0603613899044559 | 0.051 |
| 0.0385211087673583 | 0.049 |
| 0.041260834650791 | 0.051 |
| 0.0603613899044559 | 0.051 |
| 0.0603613899044559 | 0.051 |
| 0.0603613899044559 | 0.051 |
| 0.0503586714959736 | 0 |
| 0.0454878557360863 | 0.064 |
| 0.0503586714959736 | 0 |
| 0.0603613899044559 | 0.051 |
| 0.0482356166269358 | 0.038 |
| 0.0503586714959736 | 0 |
| 0.0503586714959736 | 0 |
| 0.0603613899044559 | 0.051 |
| 0.0603613899044559 | 0.051 |
| 0.0603613899044559 | 0.051 |
| 0.0603613899044559 | 0.051 |
| 0.0603613899044559 | 0.051 |
| 0.0578874727392222 | 0.037 |
| 0.0603613899044559 | 0.051 |
| 0.0295987791109 | 0.051 |
| 0.0482356166269358 | 0.038 |
| 0.0575623212859415 | 0.051 |
| 0.062802977051551 | 0.061 |
| 0.0461494954903943 | 0.064 |
| 0.0462911288640591 | 0.066 |
| 0.0375454693675201 | 0.048 |
| 0.040540503649944 | 0 |
| 0.046489533312539 | 0.054 |
| 0.0612409485583592 | 0.059 |
| 0.046489533312539 | 0.054 |
| 0.040540503649944 | 0 |
| 0.040540503649944 | 0 |
| 0.0532949252081527 | 0.067 |
| 0.0526426285670691 | 0 |
| 0.0526426285670691 | 0 |
| 0.0615134104665263 | 0.054 |
| 0.0526426285670691 | 0 |
| 0.046489533312539 | 0.054 |
| 0.0717390745932474 | 0.075 |
| 0.040540503649944 | 0 |
| 0.046489533312539 | 0.054 |
| 0.0526426285670691 | 0 |
| 0.046489533312539 | 0.054 |
| 0.046489533312539 | 0.054 |
| 0.0526426285670691 | 0 |
| 0.046489533312539 | 0.054 |
| 0.040540503649944 | 0 |
| 0.046489533312539 | 0.054 |
| 0.046489533312539 | 0.054 |
| 0.0526426285670691 | 0 |
| 0.046489533312539 | 0.054 |
| 0.046489533312539 | 0.054 |
| 0.046489533312539 | 0.054 |
| 0.046489533312539 | 0.054 |
| 0.046489533312539 | 0.054 |
| 0.0548703716926517 | 0.064 |
| 0.046489533312539 | 0.054 |
| 0.0450215231861821 | 0.058 |
| 0.046489533312539 | 0.054 |
| 0.046489533312539 | 0.054 |
| 0.046489533312539 | 0.054 |
| 0.046489533312539 | 0.054 |
| 0.0515138684318981 | 0.06 |
| 0.046489533312539 | 0.054 |
| 0.0586752425886481 | 0.057 |
| 0.046489533312539 | 0.054 |
| 0.0515138684318981 | 0.06 |
| 0.0515138684318981 | 0.06 |
| 0.046489533312539 | 0.054 |
| 0.0515138684318981 | 0.06 |
| 0.046489533312539 | 0.054 |
| 0.0515138684318981 | 0.06 |
| 0.0568931905164984 | 0.06 |
| 0.045111758848116 | 0.055 |
| 0.046489533312539 | 0 |
| 0.046489533312539 | 0.054 |
| 0.0515138684318981 | 0.06 |
| 0.0515138684318981 | 0.06 |
| 0.0577450297524971 | 0.054 |
| 0.0385253450599359 | 0.054 |
| 0.0515138684318981 | 0.06 |
| 0.0515138684318981 | 0.06 |
| 0.0582734086491483 | 0.069 |
| 0.046489533312539 | 0.054 |
| 0.0515138684318981 | 0.06 |
| 0.0515138684318981 | 0.06 |
| 0.0538993331927013 | 0.084 |
| 0.0476695877131008 | 0.057 |
| 0.046489533312539 | 0.054 |
| 0.0568931905164984 | 0.06 |
| 0.046489533312539 | 0.054 |
| 0.0515138684318981 | 0.06 |
| 0.0515138684318981 | 0.06 |
| 0.046489533312539 | 0.054 |
| 0.046489533312539 | 0.054 |
| 0.046489533312539 | 0.054 |
| 0.0 | 0 |
| 0.028645523293783 | 0.053 |
| 0.036047551605709 | 0.053 |
| 0.045309110402044 | 0.053 |
| 0.0363951034562904 | 0.043 |
| 0.028645523293783 | 0.053 |
| 0.028645523293783 | 0.053 |
| 0.0605913119203279 | 0.072 |
| 0.028645523293783 | 0.053 |
| 0.036047551605709 | 0.053 |
| 0.036047551605709 | 0.053 |
| 0.028645523293783 | 0.053 |
| 0.028645523293783 | 0.053 |
| 0.045309110402044 | 0.053 |
| 0.0636032560182729 | 0.069 |
| 0.028645523293783 | 0.053 |
| 0.028645523293783 | 0.053 |
| 0.028645523293783 | 0.053 |
| 0.036047551605709 | 0.053 |
| 0.028645523293783 | 0.053 |
| 0.028645523293783 | 0.053 |
| 0.045309110402044 | 0.053 |
| 0.045309110402044 | 0.053 |
| 0.028645523293783 | 0.053 |
| 0.028645523293783 | 0.053 |
| 0.028645523293783 | 0.053 |
| 0.045309110402044 | 0.053 |
| 0.0511314037604855 | 0.047 |
| 0.0328069963523778 | 0.047 |
| 0.0511314037604855 | 0.047 |
| 0.0511314037604855 | 0.047 |
| 0.0463008970836156 | 0.05 |
| 0.0463008970836156 | 0.05 |
| 0.0446233460795762 | 0.05 |
| 0.0463008970836156 | 0.05 |
| 0.0511314037604855 | 0.047 |
| 0.0463008970836156 | 0.05 |
| 0.0511314037604855 | 0.047 |
| 0.0523290320604748 | 0.05 |
| 0.0453532229200802 | 0.056 |
| 0.0463008970836156 | 0.05 |
| 0.0463008970836156 | 0.05 |
| 0.0523290320604748 | 0.05 |
| 0.0413384843291142 | 0.05 |
| 0.0463008970836156 | 0.05 |
| 0.0463008970836156 | 0.05 |
| 0.0393515389439438 | 0.052 |
| 0.0463008970836156 | 0.05 |
| 0.0454551462358084 | 0.05 |
| 0.0328069963523778 | 0.047 |
| 0.0511314037604855 | 0.047 |
| 0.0511314037604855 | 0.047 |
| 0.0463008970836156 | 0.05 |
| 0.0463008970836156 | 0.05 |
| 0.0463008970836156 | 0.05 |
| 0.0328069963523778 | 0.047 |
| 0.0511314037604855 | 0.047 |
| 0.0523290320604748 | 0.05 |
| 0.0511314037604855 | 0.047 |
| 0.0463008970836156 | 0.05 |
| 0.0511314037604855 | 0.047 |
| 0.0525741799514987 | 0 |
| 0.0453298267708468 | 0.04 |
| 0.0525741799514987 | 0 |
| 0.0474894350253401 | 0.04 |
| 0.0372775019223854 | 0.063 |
| 0.0525741799514987 | 0 |
| 0.0434497955929289 | 0.04 |
| 0.037760917531301 | 0.042 |
| 0.0348759397294112 | 0.04 |
| 0.0525741799514987 | 0 |
| 0.0525741799514987 | 0 |
| 0.0474894350253401 | 0.04 |
| 0.0453298267708468 | 0.04 |
| 0.048005638198297 | 0.046 |
| 0.0525741799514987 | 0 |
| 0.0432203149470984 | 0.04 |
| 0.0484401226805842 | 0.04 |
| 0.0319079453458719 | 0.038 |
| 0.0162793105182988 | 0.046 |
| 0.0162793105182988 | 0.046 |
| 0.0545267924140078 | 0.046 |
| 0.0335624596221278 | 0.022 |
| 0.0331235514416144 | 0.038 |
| 0.0476031467643385 | 0.046 |
| 0.0162793105182988 | 0.046 |
| 0.0220787834843674 | 0.022 |
| 0.0545267924140078 | 0.046 |
| 0.0545267924140078 | 0.046 |
| 0.0162793105182988 | 0.046 |
| 0.0545267924140078 | 0.046 |
| 0.0335624596221278 | 0.022 |
| 0.0545267924140078 | 0.046 |
| 0.0369335515015119 | 0.041 |
| 0.0545267924140078 | 0.046 |
| 0.0335624596221278 | 0.022 |
| 0.0545267924140078 | 0.046 |
| 0.036040373417191 | 0.062 |
| 0.036040373417191 | 0.062 |
| 0.0527881949236597 | 0.061 |
| 0.036040373417191 | 0.062 |
| 0.0558191770581442 | 0.058 |
| 0.0527881949236597 | 0.061 |
| 0.0619946337470418 | 0.056 |
| 0.0527881949236597 | 0.061 |
| 0.0254738437385889 | 0.059 |
| 0.0527881949236597 | 0.061 |
| 0.036040373417191 | 0.062 |
| 0.0619946337470418 | 0.056 |
| 0.036040373417191 | 0.062 |
| 0.0527881949236597 | 0.061 |
| 0.0527881949236597 | 0.061 |
| 0.0527881949236597 | 0.061 |
| 0.036040373417191 | 0.062 |
| 0.0527881949236597 | 0.061 |
| 0.0619946337470418 | 0.056 |
| 0.0619946337470418 | 0.056 |
| 0.0636224698371977 | 0.062 |
| 0.0527881949236597 | 0.061 |
| 0.0619946337470418 | 0.056 |
| 0.036040373417191 | 0.062 |
| 0.0527881949236597 | 0.061 |
| 0.0527881949236597 | 0.061 |
| 0.0527881949236597 | 0.061 |
| 0.0369690682837727 | 0.056 |
| 0.0619946337470418 | 0.056 |
| 0.0527881949236597 | 0.061 |
| 0.036040373417191 | 0.062 |
| 0.0619946337470418 | 0.056 |
| 0.036040373417191 | 0.062 |
| 0.0619946337470418 | 0.056 |
| 0.0619946337470418 | 0.056 |
| 0.0619946337470418 | 0.056 |
| 0.036040373417191 | 0.062 |
| 0.0527881949236597 | 0.061 |
| 0.0619946337470418 | 0.056 |
| 0.036040373417191 | 0.062 |
| 0.036040373417191 | 0.062 |
| 0.0527881949236597 | 0.061 |
| 0.0619946337470418 | 0.056 |
| 0.0527881949236597 | 0.061 |
| 0.036040373417191 | 0.062 |
| 0.0500991458392317 | 0 |
| 0.0501420693450776 | 0 |
| 0.0511665028072794 | 0.05 |
| 0.0428314436567501 | 0.056 |
| 0.048502857272837 | 0.05 |
| 0.0466935787335314 | 0.05 |
| 0.048502857272837 | 0.05 |
| 0.0501420693450776 | 0 |
| 0.048502857272837 | 0.05 |
| 0.0501420693450776 | 0 |
| 0.0511665028072794 | 0.05 |
| 0.0501420693450776 | 0 |
| 0.048502857272837 | 0.05 |
| 0.0500991458392317 | 0 |
| 0.048502857272837 | 0.05 |
| 0.0375652861258662 | 0.05 |
| 0.0466935787335314 | 0.05 |
| 0.048502857272837 | 0.05 |
| 0.048502857272837 | 0.05 |
| 0.0511665028072794 | 0.05 |
| 0.0501420693450776 | 0 |
| 0.048502857272837 | 0.05 |
| 0.048502857272837 | 0.05 |
| 0.048502857272837 | 0.05 |
| 0.048502857272837 | 0.05 |
| 0.048502857272837 | 0.05 |
| 0.048502857272837 | 0.05 |
| 0.0501420693450776 | 0 |
| 0.048502857272837 | 0.05 |
| 0.0546639298765892 | 0.072 |
| 0.048502857272837 | 0.05 |
| 0.048502857272837 | 0.05 |
| 0.0501420693450776 | 0 |
| 0.0511665028072794 | 0.05 |
| 0.0466935787335314 | 0.05 |
| 0.0501420693450776 | 0 |
| 0.048502857272837 | 0.05 |
| 0.0501420693450776 | 0 |
| 0.048502857272837 | 0.05 |
| 0.0501420693450776 | 0 |
| 0.048502857272837 | 0.05 |
| 0.0500991458392317 | 0 |
| 0.0501420693450776 | 0 |
| 0.048502857272837 | 0.05 |
| 0.0501420693450776 | 0 |
| 0.0500991458392317 | 0 |
| 0.048502857272837 | 0.05 |
| 0.0500991458392317 | 0 |
| 0.0511665028072794 | 0.05 |
| 0.0375652861258662 | 0.05 |
| 0.0375652861258662 | 0.05 |
| 0.0511665028072794 | 0.05 |
| 0.0363951034562904 | 0.043 |
| 0.0 | 0.043 |
| 0.047881835347773 | 0.054 |
| 0.0513543113139929 | 0.043 |
| 0.06119951141238 | -0.02 |
| 0.06119951141238 | -0.02 |
| 0.0363951034562904 | 0.043 |
| 0.0362775005439049 | 0.042 |
| 0.0363951034562904 | 0.043 |
| 0.0513543113139929 | 0.043 |
| 0.0363951034562904 | 0.043 |
| 0.0363951034562904 | 0.043 |
| 0.047881835347773 | 0.054 |
| 0.0373466479044233 | 0.054 |
| 0.0513543113139929 | 0.043 |
| 0.047881835347773 | 0.054 |
| 0.0363951034562904 | 0.043 |
| 0.0373466479044233 | 0.054 |
| 0.047881835347773 | 0.054 |
| 0.047881835347773 | 0.054 |
| 0.0363951034562904 | 0.043 |
| 0.0363951034562904 | 0.043 |
| 0.047881835347773 | 0.054 |
| 0.0513543113139929 | 0.043 |
| 0.047881835347773 | 0.054 |
| 0.0363951034562904 | 0.043 |
| 0.0363951034562904 | 0.043 |
| 0.06119951141238 | -0.02 |
| 0.0373466479044233 | 0.054 |
| 0.0513543113139929 | 0.043 |
| 0.0373466479044233 | 0.054 |
| 0.0410124090488675 | 0.048 |
| 0.047881835347773 | 0.054 |
| 0.0513543113139929 | 0.043 |
| 0.047881835347773 | 0.054 |
| 0.0373466479044233 | 0.054 |
| 0.0363951034562904 | 0.043 |
| 0.06119951141238 | -0.02 |
| 0.06119951141238 | -0.02 |
| 0.047881835347773 | 0.054 |
| 0.0363951034562904 | 0.043 |
| 0.0363951034562904 | 0.043 |
| 0.047881835347773 | 0.054 |
| 0.047881835347773 | 0.054 |
| 0.0432855132716323 | 0.057 |
| 0.0227586343267228 | 0.049 |
| 0.0386402350679516 | 0.047 |
| 0.0418277716811828 | 0.051 |
| 0.0227586343267228 | 0.049 |
| 0.0467632036371535 | 0.057 |
| 0.0418277716811828 | 0.051 |
| 0.0658616304217148 | 0.057 |
| 0.051337610900158 | 0.035 |
| 0.0227586343267228 | 0.049 |
| 0.0467632036371535 | 0.057 |
| 0.0418277716811828 | 0.051 |
| 0.0644948921648154 | 0.063 |
| 0.0467632036371535 | 0.057 |
| 0.0587778436852275 | 0.062 |
| 0.0467632036371535 | 0.057 |
| 0.0227586343267228 | 0.049 |
| 0.0536012104672736 | 0.048 |
| 0.00994341206684846 | 0.049 |
| 0.0459734183317977 | 0.057 |
| 0.0418277716811828 | 0.051 |
| 0.036069429663014 | 0.051 |
| 0.0467632036371535 | 0.057 |
| 0.0712409441167985 | 0.057 |
| 0.0587778436852275 | 0.062 |
| 0.0467632036371535 | 0.057 |
| 0.035853126477102 | 0.058 |
| 0.0467632036371535 | 0.057 |